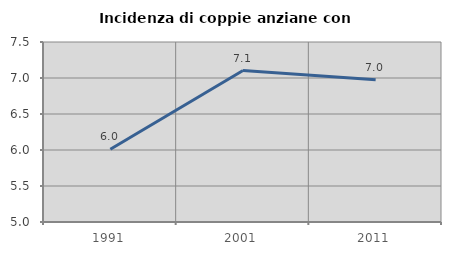
| Category | Incidenza di coppie anziane con figli |
|---|---|
| 1991.0 | 6.011 |
| 2001.0 | 7.104 |
| 2011.0 | 6.977 |